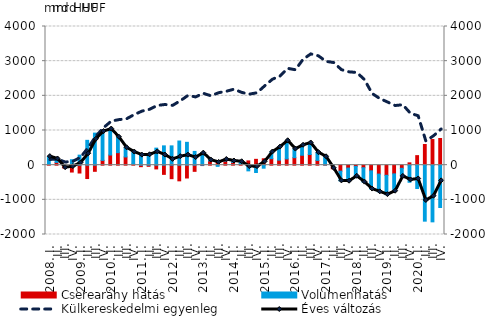
| Category | Cserearány hatás | Volumenhatás |
|---|---|---|
| 2008. I. | 17.715 | 228.858 |
|          II. | 78.837 | 99.435 |
|          III. | -83.133 | 10.01 |
|          IV. | -198.379 | 157.11 |
| 2009. I. | -226.52 | 289.366 |
|          II. | -385.792 | 716.289 |
|          III. | -177.271 | 924.361 |
|          IV. | 138.261 | 831.39 |
| 2010. I. | 293.094 | 748.867 |
|          II. | 361.008 | 445.901 |
|          III. | 237.758 | 263.364 |
|          IV. | 30.371 | 347.354 |
| 2011. I. | -43.551 | 332.719 |
|          II. | -32.161 | 330.977 |
|          III. | -107.92 | 491.3 |
|          IV. | -265.492 | 556.713 |
| 2012. I. | -389.725 | 556.506 |
|          II. | -451.99 | 696.56 |
|          III. | -369.981 | 659.005 |
|          IV. | -178.053 | 396.694 |
| 2013. I. | -11.397 | 358.094 |
|          II. | 123.099 | 21.412 |
|          III. | 113.669 | -34.302 |
|          IV. | 119.202 | 44.423 |
| 2014. I. | 82.452 | 36.966 |
|          II. | 35.068 | 62.922 |
|          III. | 122.918 | -164.329 |
|          IV. | 168.094 | -211.056 |
| 2015. I. | 184.356 | -87.151 |
|          II. | 187.983 | 189.92 |
|          III. | 145.078 | 375.864 |
|          IV. | 180.904 | 522.743 |
| 2016. I. | 216.596 | 247.523 |
|          II. | 285.796 | 288.25 |
|          III. | 307.369 | 332.29 |
|          IV. | 136.451 | 225.289 |
| 2017. I. | 6.094 | 235.267 |
|          II. | -102.9 | 11.935 |
|          III. | -173.212 | -280.562 |
|          IV. | -84.241 | -378.308 |
| 2018. I. | -37.002 | -283.107 |
|          II. | -74.46 | -414.997 |
|          III. | -164.049 | -525.001 |
|          IV. | -258.316 | -510.831 |
| 2019. I. | -292.476 | -558.539 |
|          II. | -251.556 | -499.06 |
|          III. | -91.069 | -232.396 |
|          IV. | 66.601 | -493.333 |
| 2020. I. | 274.891 | -672.942 |
|          II. | 595.746 | -1615.121 |
|          III. | 739.255 | -1635.079 |
|          IV. | 769.032 | -1221.52 |